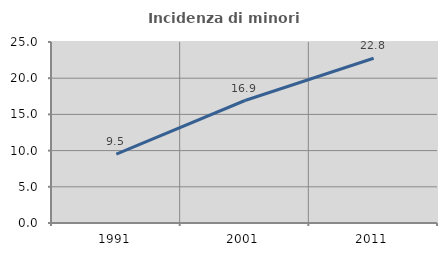
| Category | Incidenza di minori stranieri |
|---|---|
| 1991.0 | 9.524 |
| 2001.0 | 16.919 |
| 2011.0 | 22.751 |